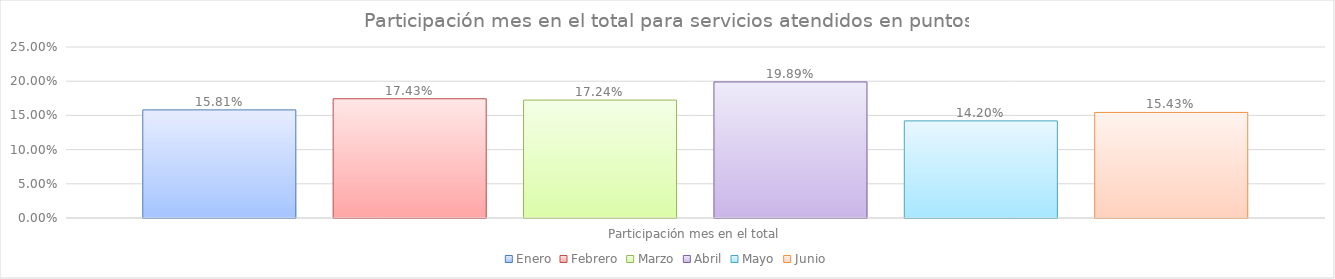
| Category | Enero | Febrero | Marzo | Abril | Mayo | Junio |
|---|---|---|---|---|---|---|
| Participación mes en el total | 0.158 | 0.174 | 0.172 | 0.199 | 0.142 | 0.154 |